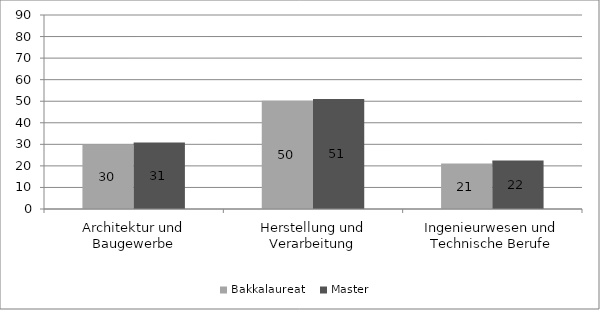
| Category | Bakkalaureat  | Master  |
|---|---|---|
| Architektur und Baugewerbe | 29.811 | 30.872 |
| Herstellung und Verarbeitung | 50.265 | 51.087 |
| Ingenieurwesen und Technische Berufe | 21.143 | 22.453 |